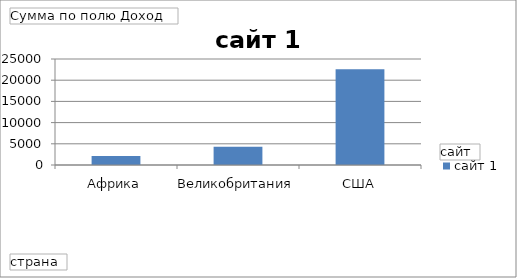
| Category | сайт 1 |
|---|---|
| Африка | 2115 |
| Великобритания  | 4325 |
| США | 22560 |